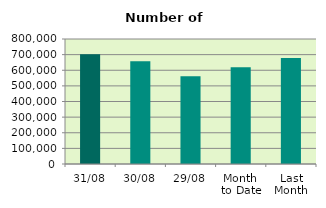
| Category | Series 0 |
|---|---|
| 31/08 | 702702 |
| 30/08 | 657734 |
| 29/08 | 561356 |
| Month 
to Date | 618945.565 |
| Last
Month | 677996.667 |